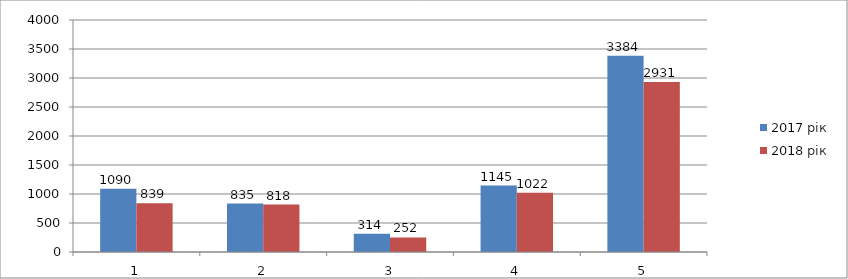
| Category | 2017 рік | 2018 рік |
|---|---|---|
| 0 | 1090 | 839 |
| 1 | 835 | 818 |
| 2 | 314 | 252 |
| 3 | 1145 | 1022 |
| 4 | 3384 | 2931 |